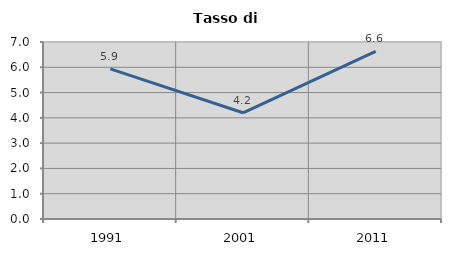
| Category | Tasso di disoccupazione   |
|---|---|
| 1991.0 | 5.94 |
| 2001.0 | 4.201 |
| 2011.0 | 6.626 |